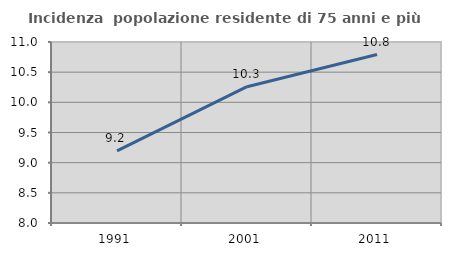
| Category | Incidenza  popolazione residente di 75 anni e più |
|---|---|
| 1991.0 | 9.194 |
| 2001.0 | 10.259 |
| 2011.0 | 10.792 |